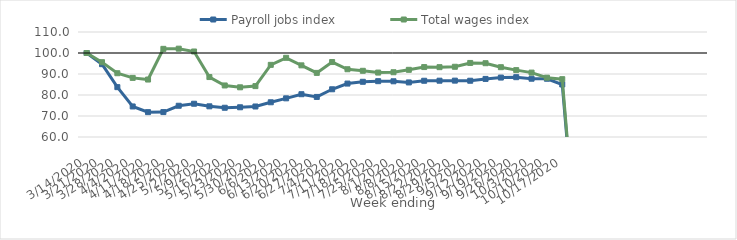
| Category | Payroll jobs index | Total wages index |
|---|---|---|
| 14/03/2020 | 100 | 100 |
| 21/03/2020 | 94.681 | 95.628 |
| 28/03/2020 | 83.739 | 90.368 |
| 04/04/2020 | 74.543 | 88.15 |
| 11/04/2020 | 71.836 | 87.362 |
| 18/04/2020 | 71.862 | 101.977 |
| 25/04/2020 | 74.878 | 102.063 |
| 02/05/2020 | 75.838 | 100.72 |
| 09/05/2020 | 74.609 | 88.542 |
| 16/05/2020 | 73.923 | 84.542 |
| 23/05/2020 | 74.158 | 83.665 |
| 30/05/2020 | 74.528 | 84.228 |
| 06/06/2020 | 76.536 | 94.356 |
| 13/06/2020 | 78.408 | 97.709 |
| 20/06/2020 | 80.376 | 94.119 |
| 27/06/2020 | 79.084 | 90.521 |
| 04/07/2020 | 82.73 | 95.692 |
| 11/07/2020 | 85.439 | 92.267 |
| 18/07/2020 | 86.294 | 91.522 |
| 25/07/2020 | 86.582 | 90.684 |
| 01/08/2020 | 86.531 | 90.837 |
| 08/08/2020 | 85.989 | 91.99 |
| 15/08/2020 | 86.779 | 93.302 |
| 22/08/2020 | 86.812 | 93.253 |
| 29/08/2020 | 86.84 | 93.44 |
| 05/09/2020 | 86.788 | 95.265 |
| 12/09/2020 | 87.659 | 95.138 |
| 19/09/2020 | 88.302 | 93.242 |
| 26/09/2020 | 88.488 | 91.848 |
| 03/10/2020 | 87.757 | 90.663 |
| 10/10/2020 | 87.738 | 88.251 |
| 17/10/2020 | 84.991 | 87.536 |